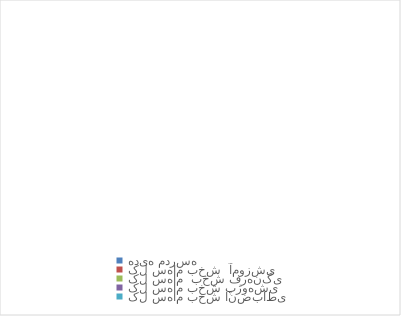
| Category | Series 0 | Series 1 |
|---|---|---|
| هدیه مدرسه | 0 |  |
| کل سهام بخش  آموزشی | 0 |  |
| کل سهام  بخش فرهنگی | 0 |  |
| کل سهام بخش پژوهشی | 0 |  |
| کل سهام بخش انضباطی | 0 |  |